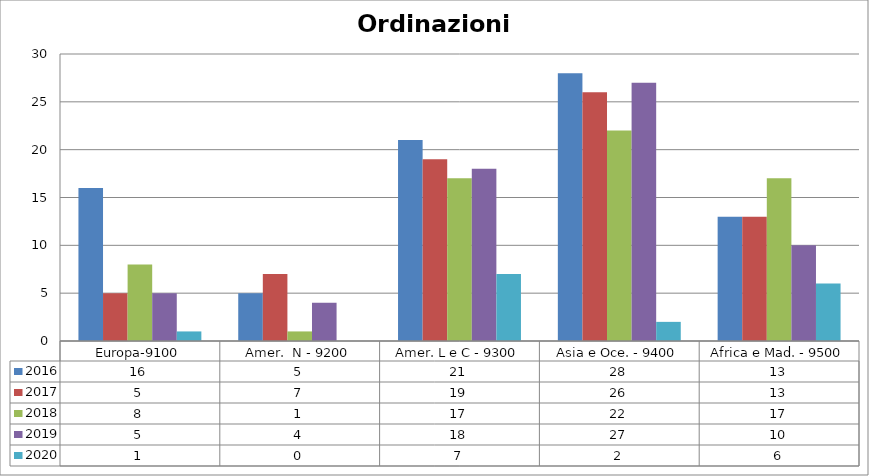
| Category | 2016 | 2017 | 2018 | 2019 | 2020 |
|---|---|---|---|---|---|
| Europa-9100 | 16 | 5 | 8 | 5 | 1 |
| Amer.  N - 9200 | 5 | 7 | 1 | 4 | 0 |
| Amer. L e C - 9300 | 21 | 19 | 17 | 18 | 7 |
| Asia e Oce. - 9400 | 28 | 26 | 22 | 27 | 2 |
| Africa e Mad. - 9500 | 13 | 13 | 17 | 10 | 6 |